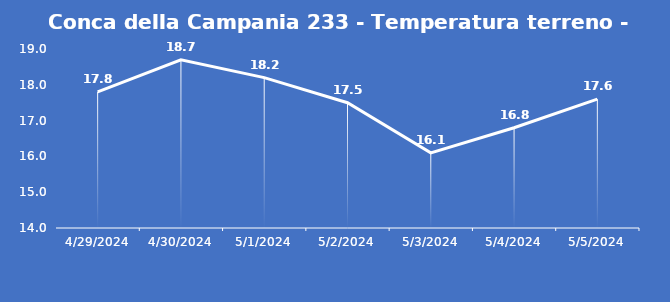
| Category | Conca della Campania 233 - Temperatura terreno - Grezzo (°C) |
|---|---|
| 4/29/24 | 17.8 |
| 4/30/24 | 18.7 |
| 5/1/24 | 18.2 |
| 5/2/24 | 17.5 |
| 5/3/24 | 16.1 |
| 5/4/24 | 16.8 |
| 5/5/24 | 17.6 |